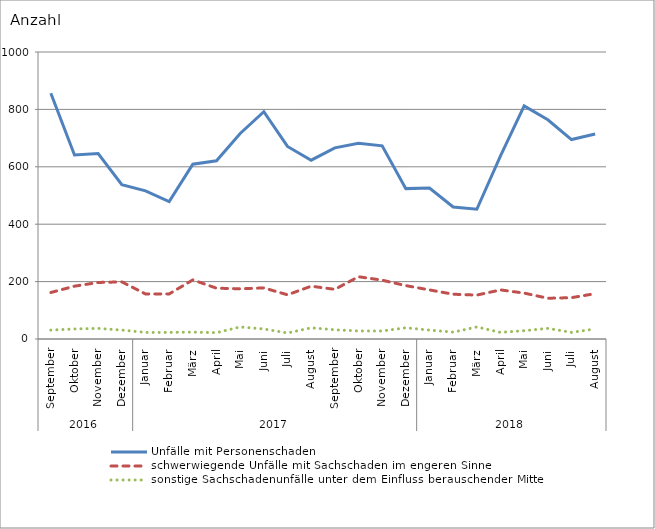
| Category | Unfälle mit Personenschaden | schwerwiegende Unfälle mit Sachschaden im engeren Sinne | sonstige Sachschadenunfälle unter dem Einfluss berauschender Mittel |
|---|---|---|---|
| 0 | 856 | 162 | 31 |
| 1 | 641 | 184 | 35 |
| 2 | 646 | 197 | 37 |
| 3 | 538 | 199 | 31 |
| 4 | 516 | 157 | 23 |
| 5 | 479 | 157 | 23 |
| 6 | 609 | 206 | 24 |
| 7 | 621 | 177 | 22 |
| 8 | 716 | 175 | 42 |
| 9 | 792 | 178 | 35 |
| 10 | 671 | 154 | 21 |
| 11 | 623 | 184 | 39 |
| 12 | 666 | 173 | 32 |
| 13 | 682 | 217 | 28 |
| 14 | 673 | 205 | 28 |
| 15 | 524 | 186 | 39 |
| 16 | 526 | 171 | 31 |
| 17 | 460 | 156 | 24 |
| 18 | 452 | 153 | 42 |
| 19 | 638 | 171 | 23 |
| 20 | 812 | 160 | 29 |
| 21 | 764 | 142 | 37 |
| 22 | 695 | 144 | 23 |
| 23 | 714 | 158 | 35 |